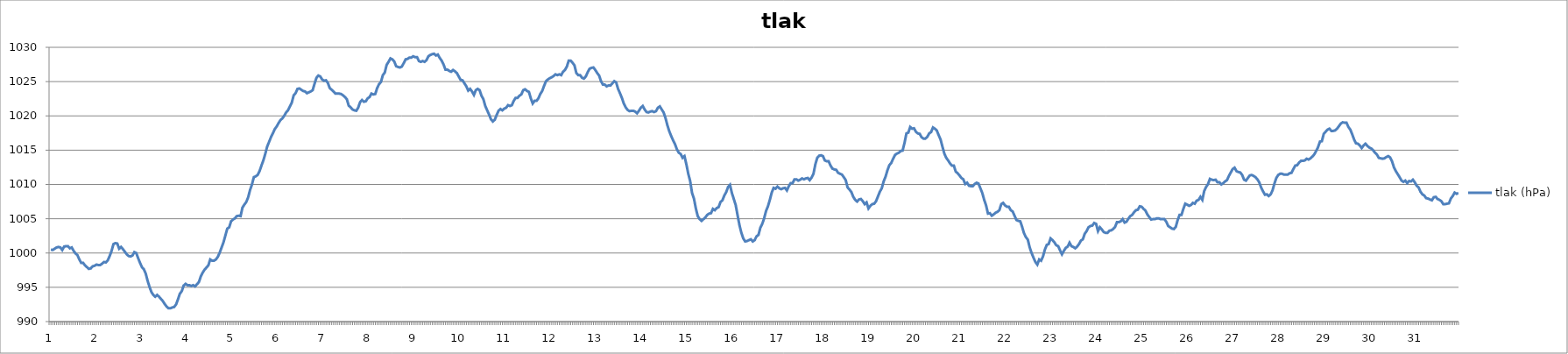
| Category | tlak (hPa) |
|---|---|
| 0 | 1000.5 |
| 1 | 1000.44 |
| 2 | 1000.63 |
| 3 | 1000.81 |
| 4 | 1000.88 |
| 5 | 1000.81 |
| 6 | 1000.44 |
| 7 | 1000.94 |
| 8 | 1001 |
| 9 | 1001 |
| 10 | 1000.69 |
| 11 | 1000.81 |
| 12 | 1000.31 |
| 13 | 999.94 |
| 14 | 999.69 |
| 15 | 999.06 |
| 16 | 998.56 |
| 17 | 998.56 |
| 18 | 998.19 |
| 19 | 997.94 |
| 20 | 997.69 |
| 21 | 997.75 |
| 22 | 998.06 |
| 23 | 998.13 |
| 24 | 998.31 |
| 25 | 998.25 |
| 26 | 998.25 |
| 27 | 998.44 |
| 28 | 998.69 |
| 29 | 998.63 |
| 30 | 998.94 |
| 31 | 999.56 |
| 32 | 1000.31 |
| 33 | 1001.31 |
| 34 | 1001.44 |
| 35 | 1001.38 |
| 36 | 1000.63 |
| 37 | 1000.88 |
| 38 | 1000.56 |
| 39 | 1000.19 |
| 40 | 999.81 |
| 41 | 999.56 |
| 42 | 999.5 |
| 43 | 999.63 |
| 44 | 1000.13 |
| 45 | 1000 |
| 46 | 999.25 |
| 47 | 998.56 |
| 48 | 997.94 |
| 49 | 997.63 |
| 50 | 997 |
| 51 | 995.94 |
| 52 | 995.06 |
| 53 | 994.31 |
| 54 | 993.88 |
| 55 | 993.63 |
| 56 | 993.88 |
| 57 | 993.63 |
| 58 | 993.31 |
| 59 | 993 |
| 60 | 992.56 |
| 61 | 992.19 |
| 62 | 991.94 |
| 63 | 991.94 |
| 64 | 992.06 |
| 65 | 992.13 |
| 66 | 992.5 |
| 67 | 993.25 |
| 68 | 994.06 |
| 69 | 994.44 |
| 70 | 995.25 |
| 71 | 995.5 |
| 72 | 995.31 |
| 73 | 995.31 |
| 74 | 995.19 |
| 75 | 995.31 |
| 76 | 995.13 |
| 77 | 995.44 |
| 78 | 995.75 |
| 79 | 996.56 |
| 80 | 997.13 |
| 81 | 997.56 |
| 82 | 997.88 |
| 83 | 998.19 |
| 84 | 999.06 |
| 85 | 998.88 |
| 86 | 998.88 |
| 87 | 999.06 |
| 88 | 999.44 |
| 89 | 1000.06 |
| 90 | 1000.81 |
| 91 | 1001.56 |
| 92 | 1002.56 |
| 93 | 1003.56 |
| 94 | 1003.75 |
| 95 | 1004.63 |
| 96 | 1004.88 |
| 97 | 1005.06 |
| 98 | 1005.38 |
| 99 | 1005.44 |
| 100 | 1005.38 |
| 101 | 1006.63 |
| 102 | 1007.06 |
| 103 | 1007.44 |
| 104 | 1008.13 |
| 105 | 1009.19 |
| 106 | 1010 |
| 107 | 1011.06 |
| 108 | 1011.19 |
| 109 | 1011.38 |
| 110 | 1011.94 |
| 111 | 1012.75 |
| 112 | 1013.5 |
| 113 | 1014.44 |
| 114 | 1015.5 |
| 115 | 1016.19 |
| 116 | 1016.88 |
| 117 | 1017.44 |
| 118 | 1018.06 |
| 119 | 1018.44 |
| 120 | 1018.94 |
| 121 | 1019.38 |
| 122 | 1019.63 |
| 123 | 1020 |
| 124 | 1020.5 |
| 125 | 1020.81 |
| 126 | 1021.38 |
| 127 | 1021.94 |
| 128 | 1023 |
| 129 | 1023.31 |
| 130 | 1023.94 |
| 131 | 1024 |
| 132 | 1023.81 |
| 133 | 1023.63 |
| 134 | 1023.56 |
| 135 | 1023.31 |
| 136 | 1023.44 |
| 137 | 1023.56 |
| 138 | 1023.75 |
| 139 | 1024.69 |
| 140 | 1025.56 |
| 141 | 1025.88 |
| 142 | 1025.75 |
| 143 | 1025.31 |
| 144 | 1025.13 |
| 145 | 1025.19 |
| 146 | 1024.81 |
| 147 | 1024.06 |
| 148 | 1023.81 |
| 149 | 1023.56 |
| 150 | 1023.25 |
| 151 | 1023.25 |
| 152 | 1023.25 |
| 153 | 1023.19 |
| 154 | 1023 |
| 155 | 1022.75 |
| 156 | 1022.44 |
| 157 | 1021.5 |
| 158 | 1021.25 |
| 159 | 1020.94 |
| 160 | 1020.81 |
| 161 | 1020.75 |
| 162 | 1021.19 |
| 163 | 1022 |
| 164 | 1022.31 |
| 165 | 1022.06 |
| 166 | 1022.13 |
| 167 | 1022.56 |
| 168 | 1022.75 |
| 169 | 1023.25 |
| 170 | 1023.13 |
| 171 | 1023.19 |
| 172 | 1024.06 |
| 173 | 1024.63 |
| 174 | 1024.94 |
| 175 | 1025.94 |
| 176 | 1026.31 |
| 177 | 1027.44 |
| 178 | 1027.88 |
| 179 | 1028.38 |
| 180 | 1028.25 |
| 181 | 1027.94 |
| 182 | 1027.25 |
| 183 | 1027.13 |
| 184 | 1027.06 |
| 185 | 1027.19 |
| 186 | 1027.69 |
| 187 | 1028.25 |
| 188 | 1028.31 |
| 189 | 1028.5 |
| 190 | 1028.5 |
| 191 | 1028.69 |
| 192 | 1028.56 |
| 193 | 1028.56 |
| 194 | 1028 |
| 195 | 1027.88 |
| 196 | 1028 |
| 197 | 1027.88 |
| 198 | 1028.13 |
| 199 | 1028.69 |
| 200 | 1028.88 |
| 201 | 1029 |
| 202 | 1029.06 |
| 203 | 1028.81 |
| 204 | 1028.94 |
| 205 | 1028.44 |
| 206 | 1028.06 |
| 207 | 1027.5 |
| 208 | 1026.75 |
| 209 | 1026.75 |
| 210 | 1026.56 |
| 211 | 1026.44 |
| 212 | 1026.69 |
| 213 | 1026.5 |
| 214 | 1026.25 |
| 215 | 1025.75 |
| 216 | 1025.25 |
| 217 | 1025.19 |
| 218 | 1024.75 |
| 219 | 1024.31 |
| 220 | 1023.69 |
| 221 | 1023.94 |
| 222 | 1023.56 |
| 223 | 1023.06 |
| 224 | 1023.75 |
| 225 | 1023.94 |
| 226 | 1023.75 |
| 227 | 1022.94 |
| 228 | 1022.44 |
| 229 | 1021.44 |
| 230 | 1020.81 |
| 231 | 1020.19 |
| 232 | 1019.5 |
| 233 | 1019.19 |
| 234 | 1019.44 |
| 235 | 1020.13 |
| 236 | 1020.75 |
| 237 | 1021 |
| 238 | 1020.81 |
| 239 | 1021.06 |
| 240 | 1021.19 |
| 241 | 1021.56 |
| 242 | 1021.44 |
| 243 | 1021.56 |
| 244 | 1022.19 |
| 245 | 1022.63 |
| 246 | 1022.63 |
| 247 | 1022.94 |
| 248 | 1023.13 |
| 249 | 1023.75 |
| 250 | 1023.88 |
| 251 | 1023.63 |
| 252 | 1023.5 |
| 253 | 1022.56 |
| 254 | 1021.81 |
| 255 | 1022.19 |
| 256 | 1022.19 |
| 257 | 1022.56 |
| 258 | 1023.19 |
| 259 | 1023.63 |
| 260 | 1024.38 |
| 261 | 1025.06 |
| 262 | 1025.31 |
| 263 | 1025.5 |
| 264 | 1025.63 |
| 265 | 1025.81 |
| 266 | 1026.06 |
| 267 | 1025.94 |
| 268 | 1026.06 |
| 269 | 1025.94 |
| 270 | 1026.44 |
| 271 | 1026.69 |
| 272 | 1027.19 |
| 273 | 1028.06 |
| 274 | 1028.06 |
| 275 | 1027.75 |
| 276 | 1027.38 |
| 277 | 1026.25 |
| 278 | 1025.94 |
| 279 | 1025.94 |
| 280 | 1025.56 |
| 281 | 1025.44 |
| 282 | 1025.75 |
| 283 | 1026.38 |
| 284 | 1026.88 |
| 285 | 1027 |
| 286 | 1027.06 |
| 287 | 1026.69 |
| 288 | 1026.25 |
| 289 | 1025.88 |
| 290 | 1025.06 |
| 291 | 1024.56 |
| 292 | 1024.56 |
| 293 | 1024.31 |
| 294 | 1024.44 |
| 295 | 1024.44 |
| 296 | 1024.75 |
| 297 | 1025.06 |
| 298 | 1024.88 |
| 299 | 1023.94 |
| 300 | 1023.31 |
| 301 | 1022.63 |
| 302 | 1021.81 |
| 303 | 1021.25 |
| 304 | 1020.88 |
| 305 | 1020.69 |
| 306 | 1020.75 |
| 307 | 1020.75 |
| 308 | 1020.63 |
| 309 | 1020.38 |
| 310 | 1020.75 |
| 311 | 1021.19 |
| 312 | 1021.44 |
| 313 | 1020.94 |
| 314 | 1020.56 |
| 315 | 1020.5 |
| 316 | 1020.63 |
| 317 | 1020.69 |
| 318 | 1020.56 |
| 319 | 1020.69 |
| 320 | 1021.19 |
| 321 | 1021.38 |
| 322 | 1020.94 |
| 323 | 1020.5 |
| 324 | 1019.69 |
| 325 | 1018.63 |
| 326 | 1017.75 |
| 327 | 1017.06 |
| 328 | 1016.44 |
| 329 | 1015.88 |
| 330 | 1015.13 |
| 331 | 1014.63 |
| 332 | 1014.44 |
| 333 | 1013.88 |
| 334 | 1014.13 |
| 335 | 1012.94 |
| 336 | 1011.56 |
| 337 | 1010.5 |
| 338 | 1008.75 |
| 339 | 1007.94 |
| 340 | 1006.5 |
| 341 | 1005.38 |
| 342 | 1004.94 |
| 343 | 1004.69 |
| 344 | 1004.94 |
| 345 | 1005.19 |
| 346 | 1005.56 |
| 347 | 1005.75 |
| 348 | 1005.81 |
| 349 | 1006.44 |
| 350 | 1006.25 |
| 351 | 1006.56 |
| 352 | 1006.69 |
| 353 | 1007.44 |
| 354 | 1007.69 |
| 355 | 1008.38 |
| 356 | 1008.88 |
| 357 | 1009.63 |
| 358 | 1009.94 |
| 359 | 1008.75 |
| 360 | 1007.88 |
| 361 | 1007 |
| 362 | 1005.5 |
| 363 | 1004.06 |
| 364 | 1002.94 |
| 365 | 1002.13 |
| 366 | 1001.69 |
| 367 | 1001.75 |
| 368 | 1001.88 |
| 369 | 1002 |
| 370 | 1001.69 |
| 371 | 1001.88 |
| 372 | 1002.44 |
| 373 | 1002.63 |
| 374 | 1003.69 |
| 375 | 1004.25 |
| 376 | 1005.06 |
| 377 | 1006.13 |
| 378 | 1006.81 |
| 379 | 1007.75 |
| 380 | 1008.81 |
| 381 | 1009.5 |
| 382 | 1009.38 |
| 383 | 1009.69 |
| 384 | 1009.44 |
| 385 | 1009.31 |
| 386 | 1009.44 |
| 387 | 1009.5 |
| 388 | 1009.13 |
| 389 | 1009.75 |
| 390 | 1010.19 |
| 391 | 1010.19 |
| 392 | 1010.75 |
| 393 | 1010.75 |
| 394 | 1010.56 |
| 395 | 1010.69 |
| 396 | 1010.88 |
| 397 | 1010.75 |
| 398 | 1010.88 |
| 399 | 1010.94 |
| 400 | 1010.63 |
| 401 | 1011 |
| 402 | 1011.56 |
| 403 | 1012.94 |
| 404 | 1013.88 |
| 405 | 1014.19 |
| 406 | 1014.25 |
| 407 | 1014.13 |
| 408 | 1013.5 |
| 409 | 1013.38 |
| 410 | 1013.38 |
| 411 | 1012.75 |
| 412 | 1012.31 |
| 413 | 1012.19 |
| 414 | 1012.13 |
| 415 | 1011.69 |
| 416 | 1011.56 |
| 417 | 1011.44 |
| 418 | 1011.06 |
| 419 | 1010.63 |
| 420 | 1009.56 |
| 421 | 1009.25 |
| 422 | 1008.88 |
| 423 | 1008.19 |
| 424 | 1007.75 |
| 425 | 1007.5 |
| 426 | 1007.81 |
| 427 | 1007.88 |
| 428 | 1007.56 |
| 429 | 1007.13 |
| 430 | 1007.38 |
| 431 | 1006.5 |
| 432 | 1006.88 |
| 433 | 1007.13 |
| 434 | 1007.19 |
| 435 | 1007.56 |
| 436 | 1008.25 |
| 437 | 1008.94 |
| 438 | 1009.44 |
| 439 | 1010.44 |
| 440 | 1011.13 |
| 441 | 1012.06 |
| 442 | 1012.81 |
| 443 | 1013.13 |
| 444 | 1013.75 |
| 445 | 1014.31 |
| 446 | 1014.5 |
| 447 | 1014.63 |
| 448 | 1014.88 |
| 449 | 1014.94 |
| 450 | 1016.06 |
| 451 | 1017.44 |
| 452 | 1017.56 |
| 453 | 1018.38 |
| 454 | 1018.13 |
| 455 | 1018.19 |
| 456 | 1017.69 |
| 457 | 1017.44 |
| 458 | 1017.38 |
| 459 | 1016.88 |
| 460 | 1016.69 |
| 461 | 1016.69 |
| 462 | 1016.94 |
| 463 | 1017.44 |
| 464 | 1017.63 |
| 465 | 1018.31 |
| 466 | 1018.13 |
| 467 | 1017.88 |
| 468 | 1017.19 |
| 469 | 1016.56 |
| 470 | 1015.5 |
| 471 | 1014.5 |
| 472 | 1013.88 |
| 473 | 1013.5 |
| 474 | 1013.06 |
| 475 | 1012.75 |
| 476 | 1012.75 |
| 477 | 1011.88 |
| 478 | 1011.63 |
| 479 | 1011.31 |
| 480 | 1010.94 |
| 481 | 1010.75 |
| 482 | 1010.06 |
| 483 | 1010.25 |
| 484 | 1009.81 |
| 485 | 1009.75 |
| 486 | 1009.75 |
| 487 | 1010.06 |
| 488 | 1010.25 |
| 489 | 1010.13 |
| 490 | 1009.44 |
| 491 | 1008.75 |
| 492 | 1007.75 |
| 493 | 1006.94 |
| 494 | 1005.75 |
| 495 | 1005.81 |
| 496 | 1005.44 |
| 497 | 1005.63 |
| 498 | 1005.88 |
| 499 | 1006 |
| 500 | 1006.25 |
| 501 | 1007.13 |
| 502 | 1007.31 |
| 503 | 1006.94 |
| 504 | 1006.75 |
| 505 | 1006.75 |
| 506 | 1006.25 |
| 507 | 1006.06 |
| 508 | 1005.44 |
| 509 | 1004.81 |
| 510 | 1004.69 |
| 511 | 1004.63 |
| 512 | 1003.81 |
| 513 | 1002.88 |
| 514 | 1002.31 |
| 515 | 1001.94 |
| 516 | 1000.81 |
| 517 | 1000 |
| 518 | 999.31 |
| 519 | 998.69 |
| 520 | 998.31 |
| 521 | 999.06 |
| 522 | 998.88 |
| 523 | 999.5 |
| 524 | 1000.5 |
| 525 | 1001.19 |
| 526 | 1001.31 |
| 527 | 1002.13 |
| 528 | 1001.88 |
| 529 | 1001.56 |
| 530 | 1001.13 |
| 531 | 1001 |
| 532 | 1000.38 |
| 533 | 999.81 |
| 534 | 1000.31 |
| 535 | 1000.75 |
| 536 | 1000.94 |
| 537 | 1001.5 |
| 538 | 1001 |
| 539 | 1000.88 |
| 540 | 1000.69 |
| 541 | 1000.94 |
| 542 | 1001.31 |
| 543 | 1001.81 |
| 544 | 1002 |
| 545 | 1002.81 |
| 546 | 1003.19 |
| 547 | 1003.75 |
| 548 | 1003.94 |
| 549 | 1004 |
| 550 | 1004.38 |
| 551 | 1004.25 |
| 552 | 1003.19 |
| 553 | 1003.75 |
| 554 | 1003.44 |
| 555 | 1003.06 |
| 556 | 1002.94 |
| 557 | 1002.94 |
| 558 | 1003.25 |
| 559 | 1003.31 |
| 560 | 1003.5 |
| 561 | 1003.81 |
| 562 | 1004.5 |
| 563 | 1004.5 |
| 564 | 1004.63 |
| 565 | 1004.94 |
| 566 | 1004.44 |
| 567 | 1004.56 |
| 568 | 1005 |
| 569 | 1005.38 |
| 570 | 1005.56 |
| 571 | 1005.94 |
| 572 | 1006.25 |
| 573 | 1006.31 |
| 574 | 1006.81 |
| 575 | 1006.75 |
| 576 | 1006.44 |
| 577 | 1006.19 |
| 578 | 1005.63 |
| 579 | 1005.25 |
| 580 | 1004.88 |
| 581 | 1004.94 |
| 582 | 1004.94 |
| 583 | 1005.06 |
| 584 | 1005.06 |
| 585 | 1004.94 |
| 586 | 1004.94 |
| 587 | 1004.94 |
| 588 | 1004.56 |
| 589 | 1003.94 |
| 590 | 1003.75 |
| 591 | 1003.56 |
| 592 | 1003.5 |
| 593 | 1003.81 |
| 594 | 1004.81 |
| 595 | 1005.56 |
| 596 | 1005.56 |
| 597 | 1006.44 |
| 598 | 1007.19 |
| 599 | 1007.06 |
| 600 | 1006.88 |
| 601 | 1007 |
| 602 | 1007.31 |
| 603 | 1007.19 |
| 604 | 1007.63 |
| 605 | 1007.75 |
| 606 | 1008.19 |
| 607 | 1007.75 |
| 608 | 1009.06 |
| 609 | 1009.63 |
| 610 | 1010.06 |
| 611 | 1010.81 |
| 612 | 1010.69 |
| 613 | 1010.63 |
| 614 | 1010.69 |
| 615 | 1010.31 |
| 616 | 1010.31 |
| 617 | 1010 |
| 618 | 1010.19 |
| 619 | 1010.44 |
| 620 | 1010.63 |
| 621 | 1011.25 |
| 622 | 1011.75 |
| 623 | 1012.25 |
| 624 | 1012.44 |
| 625 | 1011.94 |
| 626 | 1011.81 |
| 627 | 1011.75 |
| 628 | 1011.38 |
| 629 | 1010.69 |
| 630 | 1010.56 |
| 631 | 1010.94 |
| 632 | 1011.31 |
| 633 | 1011.38 |
| 634 | 1011.25 |
| 635 | 1011.06 |
| 636 | 1010.75 |
| 637 | 1010.31 |
| 638 | 1009.56 |
| 639 | 1009 |
| 640 | 1008.5 |
| 641 | 1008.56 |
| 642 | 1008.31 |
| 643 | 1008.56 |
| 644 | 1009.13 |
| 645 | 1010.13 |
| 646 | 1010.94 |
| 647 | 1011.38 |
| 648 | 1011.56 |
| 649 | 1011.56 |
| 650 | 1011.44 |
| 651 | 1011.44 |
| 652 | 1011.44 |
| 653 | 1011.63 |
| 654 | 1011.69 |
| 655 | 1012.25 |
| 656 | 1012.75 |
| 657 | 1012.81 |
| 658 | 1013.19 |
| 659 | 1013.44 |
| 660 | 1013.44 |
| 661 | 1013.5 |
| 662 | 1013.75 |
| 663 | 1013.63 |
| 664 | 1013.81 |
| 665 | 1014.06 |
| 666 | 1014.38 |
| 667 | 1014.88 |
| 668 | 1015.44 |
| 669 | 1016.25 |
| 670 | 1016.31 |
| 671 | 1017.38 |
| 672 | 1017.69 |
| 673 | 1018 |
| 674 | 1018.13 |
| 675 | 1017.81 |
| 676 | 1017.81 |
| 677 | 1017.88 |
| 678 | 1018.13 |
| 679 | 1018.5 |
| 680 | 1018.88 |
| 681 | 1019.06 |
| 682 | 1019 |
| 683 | 1019 |
| 684 | 1018.38 |
| 685 | 1018 |
| 686 | 1017.31 |
| 687 | 1016.56 |
| 688 | 1016 |
| 689 | 1015.94 |
| 690 | 1015.69 |
| 691 | 1015.31 |
| 692 | 1015.69 |
| 693 | 1015.94 |
| 694 | 1015.63 |
| 695 | 1015.38 |
| 696 | 1015.25 |
| 697 | 1015 |
| 698 | 1014.63 |
| 699 | 1014.38 |
| 700 | 1013.88 |
| 701 | 1013.81 |
| 702 | 1013.75 |
| 703 | 1013.81 |
| 704 | 1014 |
| 705 | 1014.13 |
| 706 | 1013.94 |
| 707 | 1013.38 |
| 708 | 1012.5 |
| 709 | 1011.94 |
| 710 | 1011.5 |
| 711 | 1011.06 |
| 712 | 1010.56 |
| 713 | 1010.38 |
| 714 | 1010.56 |
| 715 | 1010.19 |
| 716 | 1010.5 |
| 717 | 1010.44 |
| 718 | 1010.69 |
| 719 | 1010.31 |
| 720 | 1009.81 |
| 721 | 1009.56 |
| 722 | 1008.94 |
| 723 | 1008.56 |
| 724 | 1008.38 |
| 725 | 1008 |
| 726 | 1007.94 |
| 727 | 1007.81 |
| 728 | 1007.69 |
| 729 | 1008.13 |
| 730 | 1008.19 |
| 731 | 1007.88 |
| 732 | 1007.75 |
| 733 | 1007.56 |
| 734 | 1007.13 |
| 735 | 1007.13 |
| 736 | 1007.19 |
| 737 | 1007.25 |
| 738 | 1007.94 |
| 739 | 1008.31 |
| 740 | 1008.81 |
| 741 | 1008.63 |
| 742 | 1008.75 |